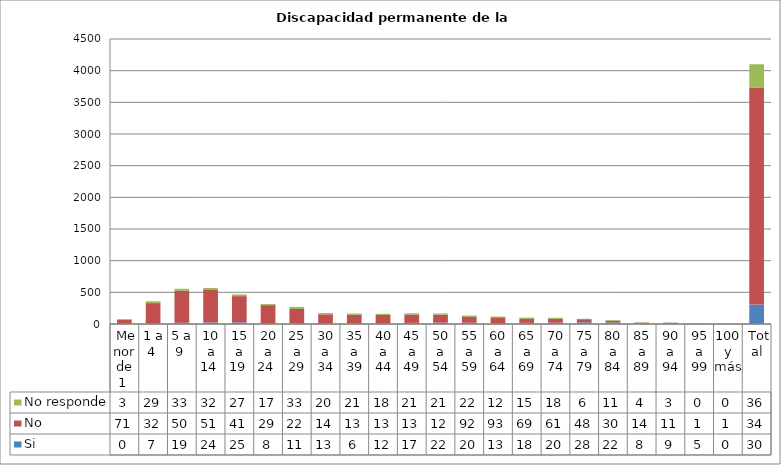
| Category | Si | No | No responde |
|---|---|---|---|
|  Menor de 1  | 0 | 71 | 3 |
| 1 a 4  | 7 | 323 | 29 |
| 5 a 9  | 19 | 504 | 33 |
| 10 a 14  | 24 | 513 | 32 |
| 15 a 19  | 25 | 415 | 27 |
| 20 a 24  | 8 | 290 | 17 |
| 25 a 29 | 11 | 226 | 33 |
| 30 a 34 | 13 | 140 | 20 |
| 35 a 39 | 6 | 139 | 21 |
| 40 a 44 | 12 | 131 | 18 |
| 45 a 49 | 17 | 132 | 21 |
| 50 a 54 | 22 | 124 | 21 |
| 55 a 59 | 20 | 92 | 22 |
| 60 a 64 | 13 | 93 | 12 |
| 65 a 69 | 18 | 69 | 15 |
| 70 a 74 | 20 | 61 | 18 |
| 75 a 79 | 28 | 48 | 6 |
| 80 a 84 | 22 | 30 | 11 |
| 85 a 89 | 8 | 14 | 4 |
| 90 a 94 | 9 | 11 | 3 |
| 95 a 99 | 5 | 1 | 0 |
| 100 y más | 0 | 1 | 0 |
|  Total | 307 | 3428 | 366 |